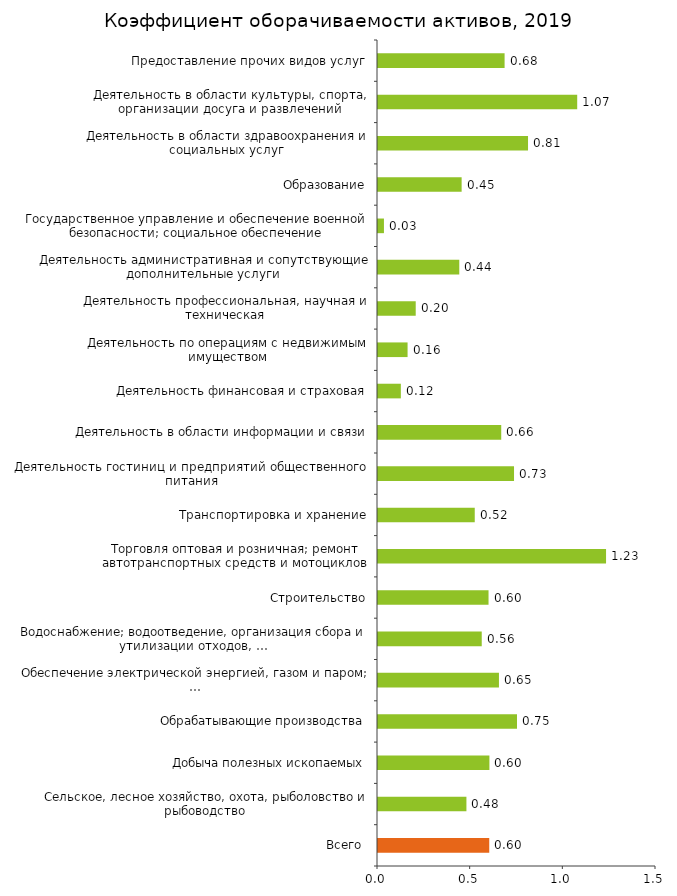
| Category | Series 0 |
|---|---|
| Всего  | 0.6 |
| Сельское, лесное хозяйство, охота, рыболовство и рыбоводство | 0.477 |
| Добыча полезных ископаемых | 0.601 |
| Обрабатывающие производства | 0.75 |
| Обеспечение электрической энергией, газом и паром; … | 0.653 |
| Водоснабжение; водоотведение, организация сбора и утилизации отходов, … | 0.56 |
| Строительство | 0.596 |
| Торговля оптовая и розничная; ремонт автотранспортных средств и мотоциклов | 1.23 |
| Транспортировка и хранение | 0.522 |
| Деятельность гостиниц и предприятий общественного питания | 0.734 |
| Деятельность в области информации и связи | 0.665 |
| Деятельность финансовая и страховая | 0.123 |
| Деятельность по операциям с недвижимым имуществом | 0.16 |
| Деятельность профессиональная, научная и техническая | 0.204 |
| Деятельность административная и сопутствующие дополнительные услуги | 0.439 |
| Государственное управление и обеспечение военной безопасности; социальное обеспечение | 0.032 |
| Образование | 0.451 |
| Деятельность в области здравоохранения и социальных услуг | 0.81 |
| Деятельность в области культуры, спорта, организации досуга и развлечений | 1.075 |
| Предоставление прочих видов услуг | 0.683 |